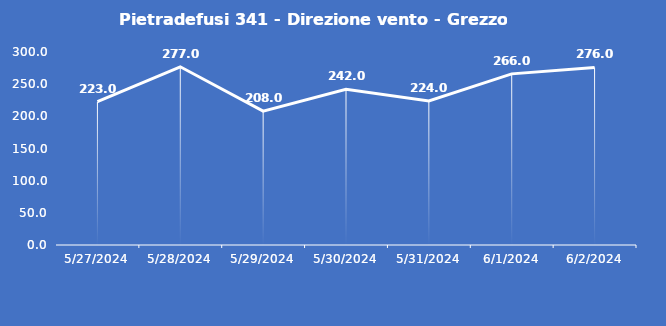
| Category | Pietradefusi 341 - Direzione vento - Grezzo (°N) |
|---|---|
| 5/27/24 | 223 |
| 5/28/24 | 277 |
| 5/29/24 | 208 |
| 5/30/24 | 242 |
| 5/31/24 | 224 |
| 6/1/24 | 266 |
| 6/2/24 | 276 |